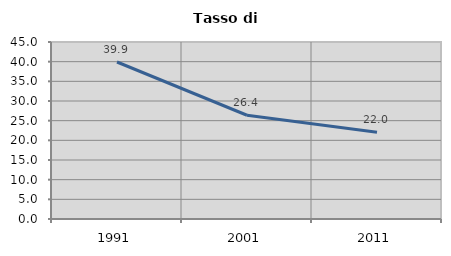
| Category | Tasso di disoccupazione   |
|---|---|
| 1991.0 | 39.918 |
| 2001.0 | 26.376 |
| 2011.0 | 22.044 |